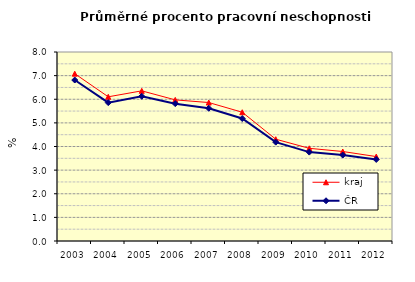
| Category | kraj | ČR |
|---|---|---|
| 2003.0 | 7.082 | 6.814 |
| 2004.0 | 6.103 | 5.857 |
| 2005.0 | 6.356 | 6.126 |
| 2006.0 | 5.973 | 5.814 |
| 2007.0 | 5.861 | 5.619 |
| 2008.0 | 5.451 | 5.184 |
| 2009.0 | 4.309 | 4.184 |
| 2010.0 | 3.923 | 3.763 |
| 2011.0 | 3.788 | 3.638 |
| 2012.0 | 3.574 | 3.452 |